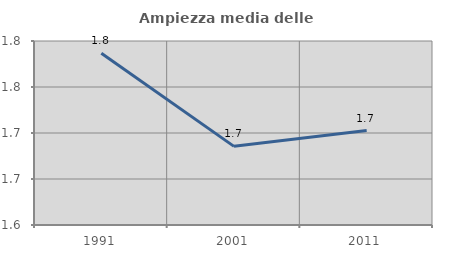
| Category | Ampiezza media delle famiglie |
|---|---|
| 1991.0 | 1.787 |
| 2001.0 | 1.685 |
| 2011.0 | 1.703 |